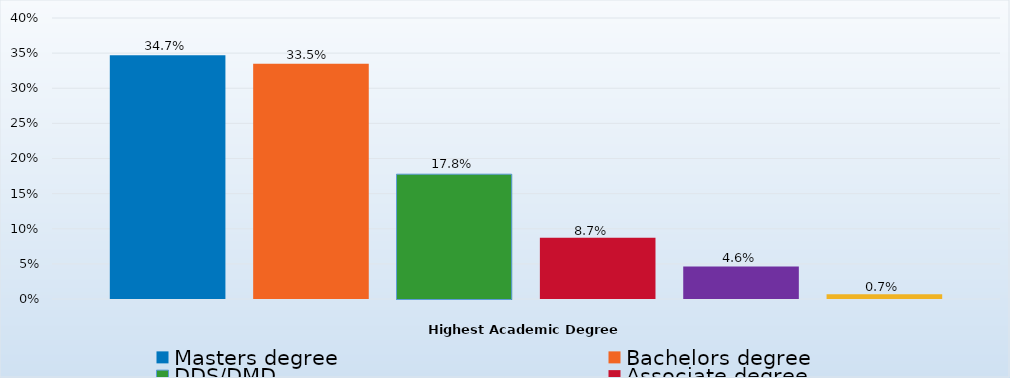
| Category | Masters degree | Bachelors degree | DDS/DMD | Associate degree | Doctorate degree | Certificate/Diploma/Other |
|---|---|---|---|---|---|---|
| Percent | 0.347 | 0.335 | 0.178 | 0.087 | 0.046 | 0.007 |